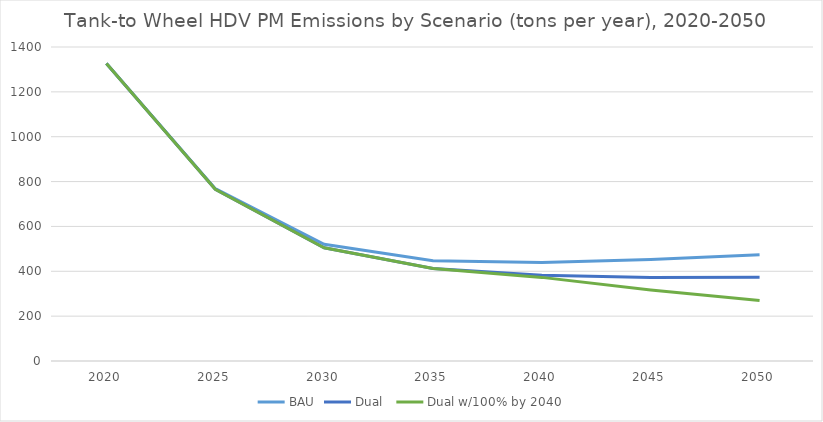
| Category | BAU | Dual  | Dual w/100% by 2040 |
|---|---|---|---|
| 2020.0 | 1326.052 | 1326.052 | 1326.052 |
| 2025.0 | 768.536 | 765.915 | 765.915 |
| 2030.0 | 520.599 | 504.889 | 504.889 |
| 2035.0 | 446.566 | 412.11 | 412.11 |
| 2040.0 | 439.16 | 382.177 | 372.81 |
| 2045.0 | 452.688 | 372.222 | 316.452 |
| 2050.0 | 473.546 | 373.333 | 269.237 |